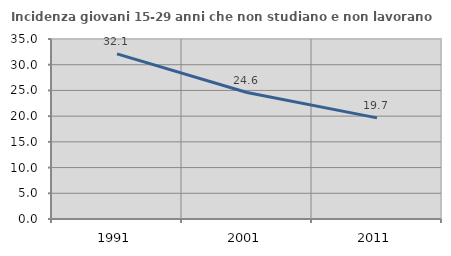
| Category | Incidenza giovani 15-29 anni che non studiano e non lavorano  |
|---|---|
| 1991.0 | 32.099 |
| 2001.0 | 24.593 |
| 2011.0 | 19.66 |